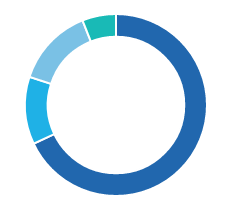
| Category | Series 0 |
|---|---|
| ● Utility | 0.68 |
| ● Metal and mining | 0.12 |
| ● Governement owned, no guarantee | 0.14 |
| ● Energy | 0.06 |